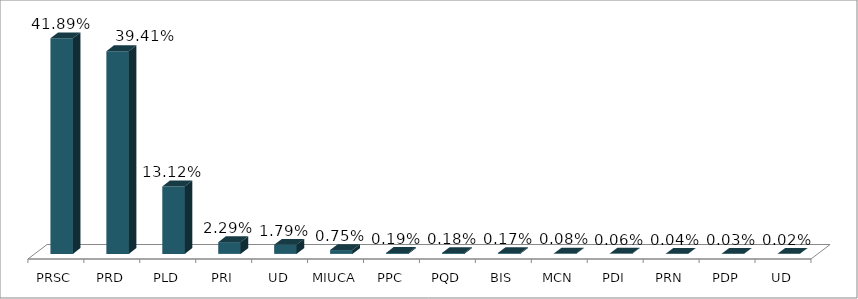
| Category | Votos % |
|---|---|
| PRSC | 0.419 |
| PRD | 0.394 |
| PLD | 0.131 |
| PRI | 0.023 |
| UD | 0.018 |
| MIUCA | 0.007 |
| PPC | 0.002 |
| PQD | 0.002 |
| BIS | 0.002 |
| MCN | 0.001 |
| PDI | 0.001 |
| PRN | 0 |
| PDP | 0 |
| UD | 0 |